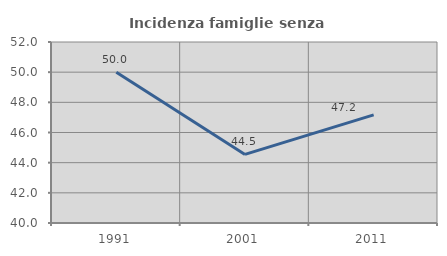
| Category | Incidenza famiglie senza nuclei |
|---|---|
| 1991.0 | 50 |
| 2001.0 | 44.545 |
| 2011.0 | 47.17 |